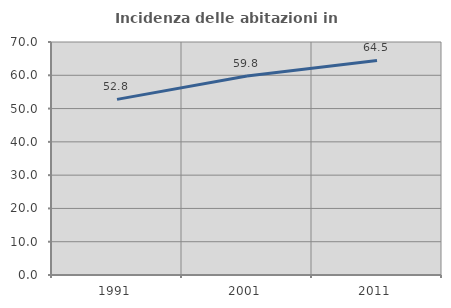
| Category | Incidenza delle abitazioni in proprietà  |
|---|---|
| 1991.0 | 52.769 |
| 2001.0 | 59.815 |
| 2011.0 | 64.471 |